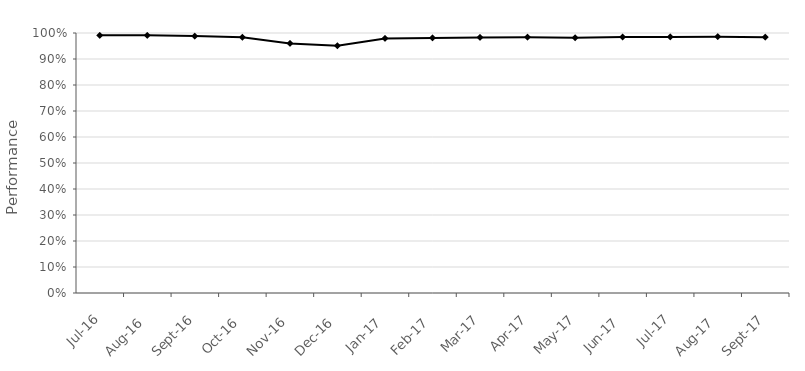
| Category | SL 4A |
|---|---|
| 2016-07-01 | 0.991 |
| 2016-08-01 | 0.991 |
| 2016-09-01 | 0.988 |
| 2016-10-01 | 0.984 |
| 2016-11-01 | 0.96 |
| 2016-12-01 | 0.951 |
| 2017-01-01 | 0.979 |
| 2017-02-01 | 0.981 |
| 2017-03-01 | 0.983 |
| 2017-04-01 | 0.984 |
| 2017-05-01 | 0.982 |
| 2017-06-01 | 0.985 |
| 2017-07-01 | 0.985 |
| 2017-08-01 | 0.986 |
| 2017-09-01 | 0.984 |